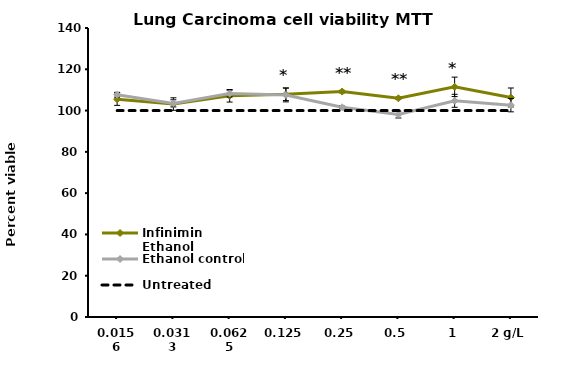
| Category | Infinimin Ethanol | Ethanol control | Untreated |
|---|---|---|---|
| 0.0156 | 105.49 | 107.68 | 100 |
| 0.0313 | 103.158 | 103.491 | 100 |
| 0.0625 | 107.156 | 108.251 | 100 |
| 0.125 | 107.871 | 107.585 | 100 |
| 0.25 | 109.203 | 101.587 | 100 |
| 0.5 | 105.966 | 98.064 | 100 |
| 1 | 111.488 | 104.729 | 100 |
| 2 g/L | 106.347 | 102.634 | 100 |